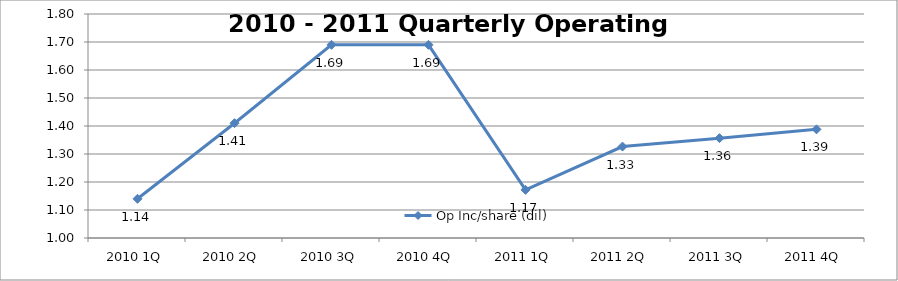
| Category | Op Inc/share (dil) |
|---|---|
| 2010 1Q | 1.14 |
| 2010 2Q | 1.41 |
| 2010 3Q | 1.69 |
| 2010 4Q | 1.69 |
| 2011 1Q | 1.172 |
| 2011 2Q | 1.327 |
| 2011 3Q | 1.357 |
| 2011 4Q | 1.388 |